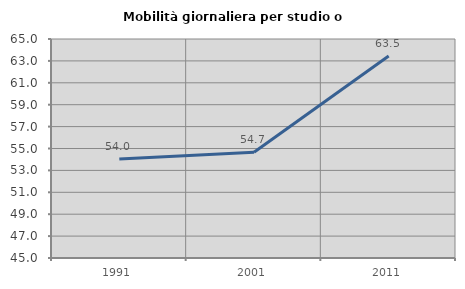
| Category | Mobilità giornaliera per studio o lavoro |
|---|---|
| 1991.0 | 54.05 |
| 2001.0 | 54.664 |
| 2011.0 | 63.456 |